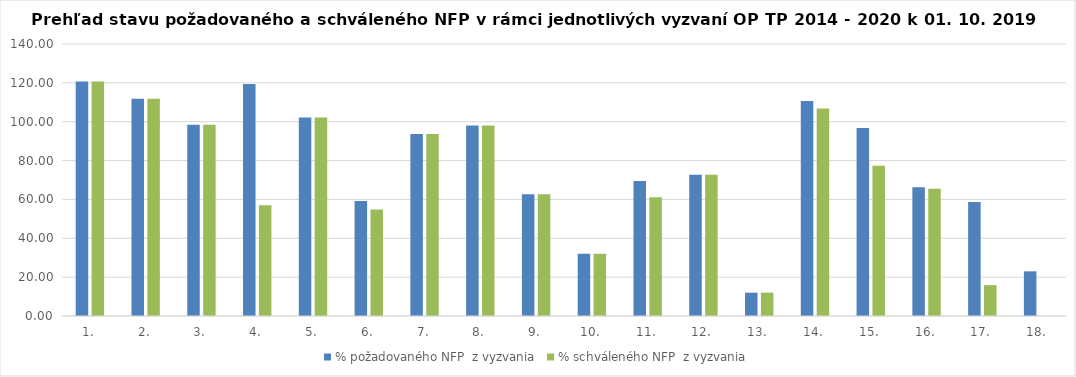
| Category | % požadovaného NFP  z vyzvania | % schváleného NFP  z vyzvania |
|---|---|---|
| 1. | 120.662 | 120.662 |
| 2. | 111.83 | 111.83 |
| 3. | 98.465 | 98.465 |
| 4. | 119.382 | 57.06 |
| 5. | 102.181 | 102.181 |
| 6. | 59.149 | 54.857 |
| 7. | 93.64 | 93.64 |
| 8. | 97.989 | 97.989 |
| 9. | 62.721 | 62.721 |
| 10. | 32.038 | 32.038 |
| 11. | 69.49 | 61.165 |
| 12. | 72.726 | 72.726 |
| 13. | 12.007 | 12.007 |
| 14. | 110.65 | 106.838 |
| 15. | 96.768 | 77.377 |
| 16. | 66.264 | 65.439 |
| 17. | 58.724 | 15.879 |
| 18. | 22.99 | 0 |